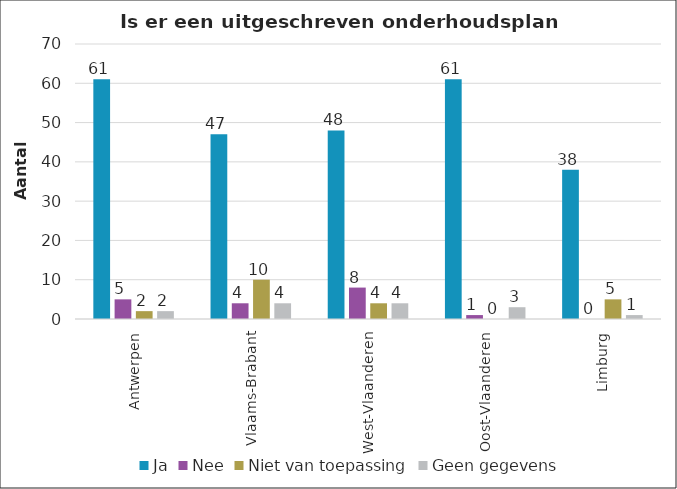
| Category | Ja | Nee | Niet van toepassing | Geen gegevens |
|---|---|---|---|---|
| Antwerpen | 61 | 5 | 2 | 2 |
| Vlaams-Brabant | 47 | 4 | 10 | 4 |
| West-Vlaanderen | 48 | 8 | 4 | 4 |
| Oost-Vlaanderen | 61 | 1 | 0 | 3 |
| Limburg | 38 | 0 | 5 | 1 |